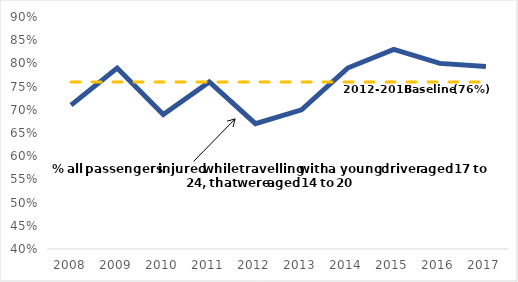
| Category | Series 0 | Series 2 |
|---|---|---|
| 2008.0 | 0.71 | 0.76 |
| 2009.0 | 0.79 | 0.76 |
| 2010.0 | 0.69 | 0.76 |
| 2011.0 | 0.76 | 0.76 |
| 2012.0 | 0.67 | 0.76 |
| 2013.0 | 0.7 | 0.76 |
| 2014.0 | 0.79 | 0.76 |
| 2015.0 | 0.83 | 0.76 |
| 2016.0 | 0.8 | 0.76 |
| 2017.0 | 0.793 | 0.76 |